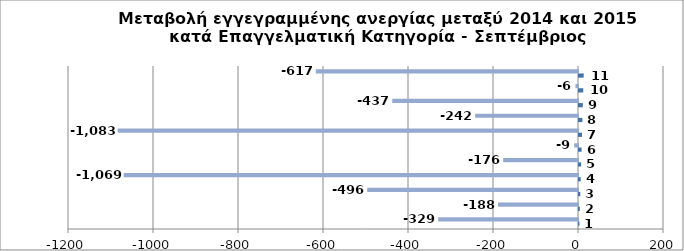
| Category | Series 0 | Series 1 |
|---|---|---|
| 0 | 1 | -329 |
| 1 | 2 | -188 |
| 2 | 3 | -496 |
| 3 | 4 | -1069 |
| 4 | 5 | -176 |
| 5 | 6 | -9 |
| 6 | 7 | -1083 |
| 7 | 8 | -242 |
| 8 | 9 | -437 |
| 9 | 10 | -6 |
| 10 | 11 | -617 |